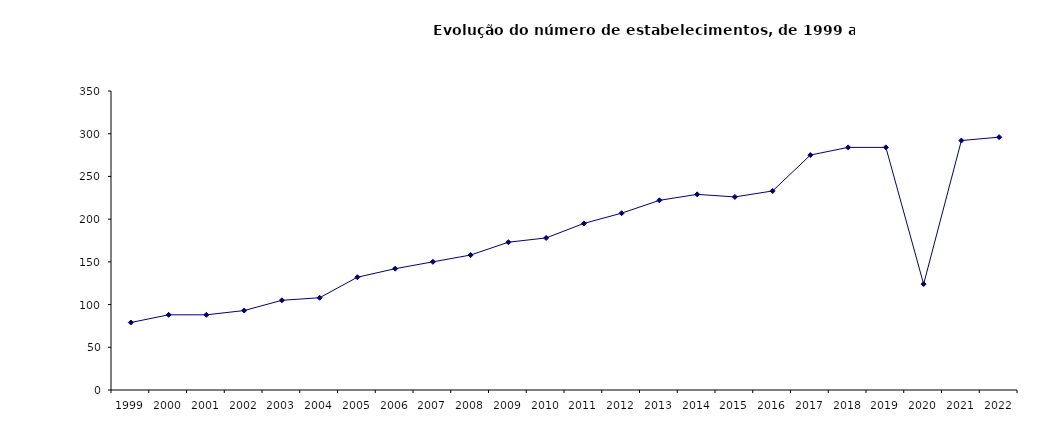
| Category | Estabelecimentos |
|---|---|
| 0 | 79 |
| 1 | 88 |
| 2 | 88 |
| 3 | 93 |
| 4 | 105 |
| 5 | 108 |
| 6 | 132 |
| 7 | 142 |
| 8 | 150 |
| 9 | 158 |
| 10 | 173 |
| 11 | 178 |
| 12 | 195 |
| 13 | 207 |
| 14 | 222 |
| 15 | 229 |
| 16 | 226 |
| 17 | 233 |
| 18 | 275 |
| 19 | 284 |
| 20 | 284 |
| 21 | 124 |
| 22 | 292 |
| 23 | 296 |